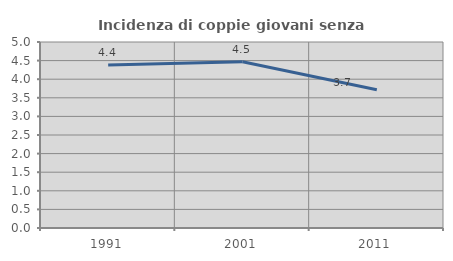
| Category | Incidenza di coppie giovani senza figli |
|---|---|
| 1991.0 | 4.381 |
| 2001.0 | 4.47 |
| 2011.0 | 3.715 |